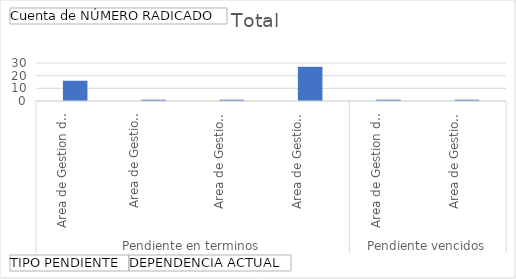
| Category | Total |
|---|---|
| 0 | 16 |
| 1 | 1 |
| 2 | 1 |
| 3 | 27 |
| 4 | 1 |
| 5 | 1 |